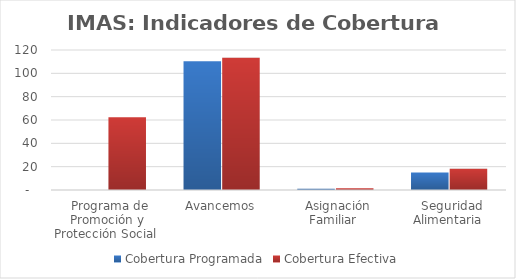
| Category | Cobertura Programada | Cobertura Efectiva |
|---|---|---|
| Programa de Promoción y Protección Social | 0 | 62.416 |
| Avancemos | 110.462 | 113.269 |
| Asignación Familiar | 1.058 | 1.403 |
| Seguridad Alimentaria | 15.072 | 18.179 |